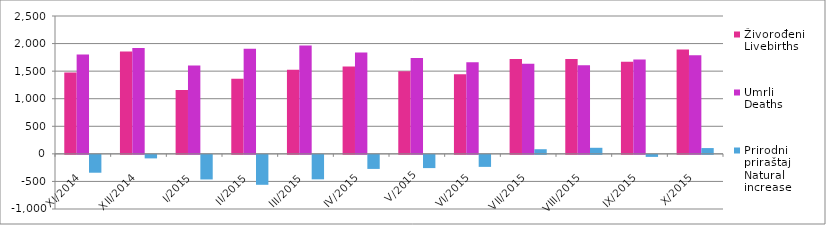
| Category | Živorođeni
Livebirths | Umrli
Deaths | Prirodni
priraštaj
Natural
increase |
|---|---|---|---|
| XI/2014 | 1476 | 1800 | -324 |
| XII/2014 | 1854 | 1918 | -64 |
| I/2015 | 1156 | 1602 | -446 |
| II/2015 | 1364 | 1907 | -543 |
| III/2015 | 1523 | 1967 | -444 |
| IV/2015 | 1582 | 1837 | -255 |
| V/2015 | 1500 | 1740 | -240 |
| VI/2015 | 1444 | 1662 | -218 |
| VII/2015 | 1718 | 1634 | 84 |
| VIII/2015 | 1719 | 1609 | 110 |
| IX/2015 | 1672 | 1709 | -37 |
| X/2015 | 1893 | 1788 | 105 |